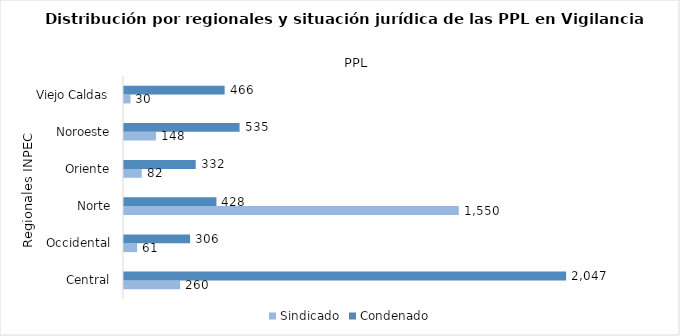
| Category | Sindicado | Condenado |
|---|---|---|
| Central | 260 | 2047 |
| Occidental | 61 | 306 |
| Norte | 1550 | 428 |
| Oriente | 82 | 332 |
| Noroeste | 148 | 535 |
| Viejo Caldas | 30 | 466 |